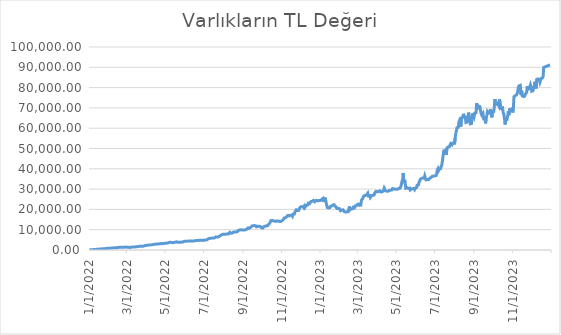
| Category | Varlıkların TL Değeri |
|---|---|
| 1/1/22 | 27.87 |
| 1/2/22 | 55.74 |
| 1/3/22 | 83.61 |
| 1/4/22 | 112.32 |
| 1/5/22 | 137.55 |
| 1/6/22 | 167.16 |
| 1/7/22 | 196 |
| 1/8/22 | 216.96 |
| 1/9/22 | 244.08 |
| 1/10/22 | 271.2 |
| 1/11/22 | 302.39 |
| 1/12/22 | 330.48 |
| 1/13/22 | 348.4 |
| 1/14/22 | 377.86 |
| 1/15/22 | 414 |
| 1/16/22 | 441.6 |
| 1/17/22 | 469.2 |
| 1/18/22 | 493.74 |
| 1/19/22 | 497.42 |
| 1/20/22 | 539 |
| 1/21/22 | 560.49 |
| 1/22/22 | 586.96 |
| 1/23/22 | 613.64 |
| 1/24/22 | 640.32 |
| 1/25/22 | 643.75 |
| 1/26/22 | 664.3 |
| 1/27/22 | 708.21 |
| 1/28/22 | 763 |
| 1/29/22 | 783.29 |
| 1/30/22 | 810.3 |
| 1/31/22 | 837.31 |
| 2/1/22 | 860.16 |
| 2/2/22 | 892.32 |
| 2/3/22 | 911.2 |
| 2/4/22 | 928.55 |
| 2/5/22 | 935.28 |
| 2/6/22 | 961.26 |
| 2/7/22 | 987.24 |
| 2/8/22 | 1026.09 |
| 2/9/22 | 1064.8 |
| 2/10/22 | 1111.1 |
| 2/11/22 | 1110.9 |
| 2/12/22 | 1133.48 |
| 2/13/22 | 1159.84 |
| 2/14/22 | 1186.2 |
| 2/15/22 | 1228.66 |
| 2/16/22 | 1282.16 |
| 2/17/22 | 1304.16 |
| 2/18/22 | 1307.32 |
| 2/19/22 | 1359.5 |
| 2/20/22 | 1386.69 |
| 2/21/22 | 1413.88 |
| 2/22/22 | 1414.04 |
| 2/23/22 | 1428.3 |
| 2/24/22 | 1364 |
| 2/25/22 | 1363.6 |
| 2/26/22 | 1403.91 |
| 2/27/22 | 1428.54 |
| 2/28/22 | 1453.17 |
| 3/1/22 | 1337.4 |
| 3/2/22 | 1324.92 |
| 3/3/22 | 1303.86 |
| 3/4/22 | 1306.62 |
| 3/5/22 | 1255.68 |
| 3/6/22 | 1275.3 |
| 3/7/22 | 1294.92 |
| 3/8/22 | 1361.44 |
| 3/9/22 | 1389.24 |
| 3/10/22 | 1442.79 |
| 3/11/22 | 1423.1 |
| 3/12/22 | 1467.57 |
| 3/13/22 | 1488.24 |
| 3/14/22 | 1508.91 |
| 3/15/22 | 1530.32 |
| 3/16/22 | 1591.5 |
| 3/17/22 | 1636.28 |
| 3/18/22 | 1669.36 |
| 3/19/22 | 1740.18 |
| 3/20/22 | 1762.49 |
| 3/21/22 | 1784.8 |
| 3/22/22 | 1823.31 |
| 3/23/22 | 1869.6 |
| 3/24/22 | 1871.65 |
| 3/25/22 | 1859.76 |
| 3/26/22 | 1872.55 |
| 3/27/22 | 1894.58 |
| 3/28/22 | 1916.61 |
| 3/29/22 | 2044.24 |
| 3/30/22 | 2248.14 |
| 3/31/22 | 2263.5 |
| 4/1/22 | 2253.16 |
| 4/2/22 | 2342.32 |
| 4/3/22 | 2367.78 |
| 4/4/22 | 2393.24 |
| 4/5/22 | 2474.75 |
| 4/6/22 | 2479.68 |
| 4/7/22 | 2490.96 |
| 4/8/22 | 2520.56 |
| 4/9/22 | 2573.01 |
| 4/10/22 | 2599 |
| 4/11/22 | 2624.99 |
| 4/12/22 | 2762.16 |
| 4/13/22 | 2797.48 |
| 4/14/22 | 2791.36 |
| 4/15/22 | 2822.4 |
| 4/16/22 | 2884.26 |
| 4/17/22 | 2911.47 |
| 4/18/22 | 2938.68 |
| 4/19/22 | 2963.71 |
| 4/20/22 | 2961.2 |
| 4/21/22 | 2991.45 |
| 4/22/22 | 3199.84 |
| 4/23/22 | 3118.8 |
| 4/24/22 | 3146.4 |
| 4/25/22 | 3174 |
| 4/26/22 | 3196.96 |
| 4/27/22 | 3125.07 |
| 4/28/22 | 3154.14 |
| 4/29/22 | 3251.08 |
| 4/30/22 | 3286.8 |
| 5/1/22 | 3314.19 |
| 5/2/22 | 3341.58 |
| 5/3/22 | 3368.97 |
| 5/4/22 | 3396.36 |
| 5/5/22 | 3423.75 |
| 5/6/22 | 3530.52 |
| 5/7/22 | 3741.42 |
| 5/8/22 | 3770.88 |
| 5/9/22 | 3800.34 |
| 5/10/22 | 3738.8 |
| 5/11/22 | 3711.23 |
| 5/12/22 | 3672.24 |
| 5/13/22 | 3596.32 |
| 5/14/22 | 3710.46 |
| 5/15/22 | 3738.15 |
| 5/16/22 | 3765.84 |
| 5/17/22 | 3879.84 |
| 5/18/22 | 3859.86 |
| 5/19/22 | 4026.83 |
| 5/20/22 | 4055.8 |
| 5/21/22 | 3812.64 |
| 5/22/22 | 3839.68 |
| 5/23/22 | 3866.72 |
| 5/24/22 | 3790.08 |
| 5/25/22 | 3825.1 |
| 5/26/22 | 3858.78 |
| 5/27/22 | 3905.79 |
| 5/28/22 | 3938.28 |
| 5/29/22 | 3964.89 |
| 5/30/22 | 3991.5 |
| 5/31/22 | 4309.54 |
| 6/1/22 | 4283.36 |
| 6/2/22 | 4261.05 |
| 6/3/22 | 4267.34 |
| 6/4/22 | 4326.05 |
| 6/5/22 | 4353.96 |
| 6/6/22 | 4381.87 |
| 6/7/22 | 4461.92 |
| 6/8/22 | 4467.9 |
| 6/9/22 | 4257.6 |
| 6/10/22 | 4404.96 |
| 6/11/22 | 4343.22 |
| 6/12/22 | 4370.03 |
| 6/13/22 | 4396.84 |
| 6/14/22 | 4374.15 |
| 6/15/22 | 4437.18 |
| 6/16/22 | 4515.68 |
| 6/17/22 | 4450.32 |
| 6/18/22 | 4620.46 |
| 6/19/22 | 4647.8 |
| 6/20/22 | 4675.14 |
| 6/21/22 | 4647.44 |
| 6/22/22 | 4671 |
| 6/23/22 | 4807.62 |
| 6/24/22 | 4845.75 |
| 6/25/22 | 4736.16 |
| 6/26/22 | 4763.07 |
| 6/27/22 | 4789.98 |
| 6/28/22 | 4816.89 |
| 6/29/22 | 4843.8 |
| 6/30/22 | 4709.62 |
| 7/1/22 | 4843.02 |
| 7/2/22 | 4862.31 |
| 7/3/22 | 4888.88 |
| 7/4/22 | 4915.45 |
| 7/5/22 | 4968.06 |
| 7/6/22 | 5049 |
| 7/7/22 | 5358 |
| 7/8/22 | 5518.8 |
| 7/9/22 | 5724.7 |
| 7/10/22 | 5754.83 |
| 7/11/22 | 5784.96 |
| 7/12/22 | 5815.09 |
| 7/13/22 | 5845.22 |
| 7/14/22 | 5855.85 |
| 7/15/22 | 5889.8 |
| 7/16/22 | 5919.85 |
| 7/17/22 | 5949.9 |
| 7/18/22 | 5979.95 |
| 7/19/22 | 6284 |
| 7/20/22 | 6474.21 |
| 7/21/22 | 6439.76 |
| 7/22/22 | 6435.1 |
| 7/23/22 | 6401.52 |
| 7/24/22 | 6432.9 |
| 7/25/22 | 6464.28 |
| 7/26/22 | 6899.31 |
| 7/27/22 | 7107.36 |
| 7/28/22 | 7208.41 |
| 7/29/22 | 7291.2 |
| 7/30/22 | 7686.73 |
| 7/31/22 | 7723.16 |
| 8/1/22 | 7759.59 |
| 8/2/22 | 7808.86 |
| 8/3/22 | 7714.2 |
| 8/4/22 | 7577.28 |
| 8/5/22 | 7812 |
| 8/6/22 | 7915.58 |
| 8/7/22 | 7951.89 |
| 8/8/22 | 7988.2 |
| 8/9/22 | 7907.38 |
| 8/10/22 | 8131.86 |
| 8/11/22 | 8692.54 |
| 8/12/22 | 8214.08 |
| 8/13/22 | 8284.5 |
| 8/14/22 | 8321.32 |
| 8/15/22 | 8358.14 |
| 8/16/22 | 8296.92 |
| 8/17/22 | 8860.01 |
| 8/18/22 | 9080.4 |
| 8/19/22 | 8928.15 |
| 8/20/22 | 8848.48 |
| 8/21/22 | 8886.62 |
| 8/22/22 | 8924.76 |
| 8/23/22 | 9063.95 |
| 8/24/22 | 9558 |
| 8/25/22 | 9420.75 |
| 8/26/22 | 9800.84 |
| 8/27/22 | 9942.4 |
| 8/28/22 | 9984 |
| 8/29/22 | 10025.6 |
| 8/30/22 | 9861.5 |
| 8/31/22 | 9902.25 |
| 9/1/22 | 9886.88 |
| 9/2/22 | 9709.35 |
| 9/3/22 | 9879.36 |
| 9/4/22 | 9919.52 |
| 9/5/22 | 9959.68 |
| 9/6/22 | 10171.65 |
| 9/7/22 | 10257.5 |
| 9/8/22 | 10441.6 |
| 9/9/22 | 10883.88 |
| 9/10/22 | 10712.02 |
| 9/11/22 | 10754.36 |
| 9/12/22 | 10796.7 |
| 9/13/22 | 11207.68 |
| 9/14/22 | 11279.73 |
| 9/15/22 | 11821.56 |
| 9/16/22 | 11820.76 |
| 9/17/22 | 11960 |
| 9/18/22 | 12006 |
| 9/19/22 | 12052 |
| 9/20/22 | 11724.54 |
| 9/21/22 | 11924.88 |
| 9/22/22 | 11402.95 |
| 9/23/22 | 11440.66 |
| 9/24/22 | 11619.84 |
| 9/25/22 | 11663.36 |
| 9/26/22 | 11706.88 |
| 9/27/22 | 11707.2 |
| 9/28/22 | 11593.38 |
| 9/29/22 | 11486.56 |
| 9/30/22 | 10936.38 |
| 10/1/22 | 10779.16 |
| 10/2/22 | 10818.5 |
| 10/3/22 | 10857.84 |
| 10/4/22 | 11564.75 |
| 10/5/22 | 11623.18 |
| 10/6/22 | 11715.21 |
| 10/7/22 | 11592 |
| 10/8/22 | 11936.88 |
| 10/9/22 | 11979.36 |
| 10/10/22 | 12021.84 |
| 10/11/22 | 12572.68 |
| 10/12/22 | 12676.8 |
| 10/13/22 | 13138.84 |
| 10/14/22 | 13032.67 |
| 10/15/22 | 14495.04 |
| 10/16/22 | 14545.37 |
| 10/17/22 | 14595.7 |
| 10/18/22 | 15059.25 |
| 10/19/22 | 14284.64 |
| 10/20/22 | 13926.29 |
| 10/21/22 | 14314.86 |
| 10/22/22 | 14050.85 |
| 10/23/22 | 14098.48 |
| 10/24/22 | 14146.11 |
| 10/25/22 | 14339.76 |
| 10/26/22 | 13957.32 |
| 10/27/22 | 14289 |
| 10/28/22 | 14330.61 |
| 10/29/22 | 13997.7 |
| 10/30/22 | 14044.05 |
| 10/31/22 | 14090.4 |
| 11/1/22 | 14435.65 |
| 11/2/22 | 14593.14 |
| 11/3/22 | 14831.17 |
| 11/4/22 | 15169 |
| 11/5/22 | 15777.54 |
| 11/6/22 | 15828.6 |
| 11/7/22 | 15879.66 |
| 11/8/22 | 15593.76 |
| 11/9/22 | 16535.79 |
| 11/10/22 | 16403.36 |
| 11/11/22 | 17044.65 |
| 11/12/22 | 16757.48 |
| 11/13/22 | 16810.51 |
| 11/14/22 | 16863.54 |
| 11/15/22 | 17165.39 |
| 11/16/22 | 17564.8 |
| 11/17/22 | 17212.02 |
| 11/18/22 | 16679.6 |
| 11/19/22 | 17603.5 |
| 11/20/22 | 17658 |
| 11/21/22 | 17712.5 |
| 11/22/22 | 18806.94 |
| 11/23/22 | 19201.44 |
| 11/24/22 | 19807.92 |
| 11/25/22 | 19529.44 |
| 11/26/22 | 19427.1 |
| 11/27/22 | 19485.97 |
| 11/28/22 | 19544.84 |
| 11/29/22 | 20569.41 |
| 11/30/22 | 20564.38 |
| 12/1/22 | 21252.4 |
| 12/2/22 | 21084 |
| 12/3/22 | 21261.33 |
| 12/4/22 | 21324.42 |
| 12/5/22 | 21387.51 |
| 12/6/22 | 20865.8 |
| 12/7/22 | 21663.73 |
| 12/8/22 | 21108.24 |
| 12/9/22 | 21338.03 |
| 12/10/22 | 22057.28 |
| 12/11/22 | 22121.4 |
| 12/12/22 | 22185.52 |
| 12/13/22 | 23016.51 |
| 12/14/22 | 23152.44 |
| 12/15/22 | 22789.7 |
| 12/16/22 | 23026.5 |
| 12/17/22 | 23850.45 |
| 12/18/22 | 23918.4 |
| 12/19/22 | 23986.35 |
| 12/20/22 | 23916.24 |
| 12/21/22 | 24402.7 |
| 12/22/22 | 23912.52 |
| 12/23/22 | 23786.91 |
| 12/24/22 | 24293.88 |
| 12/25/22 | 24361.74 |
| 12/26/22 | 24429.6 |
| 12/27/22 | 24511.9 |
| 12/28/22 | 24170.74 |
| 12/29/22 | 24077.79 |
| 12/30/22 | 24413.48 |
| 12/31/22 | 24356.45 |
| 1/1/23 | 24423.18 |
| 1/2/23 | 24489.91 |
| 1/3/23 | 24862.08 |
| 1/4/23 | 25110.45 |
| 1/5/23 | 25359.8 |
| 1/6/23 | 23680.93 |
| 1/7/23 | 25169.52 |
| 1/8/23 | 25237.18 |
| 1/9/23 | 25304.84 |
| 1/10/23 | 23587.5 |
| 1/11/23 | 22319.36 |
| 1/12/23 | 20934.81 |
| 1/13/23 | 21084.84 |
| 1/14/23 | 20731.3 |
| 1/15/23 | 20786 |
| 1/16/23 | 20840.7 |
| 1/17/23 | 21418.74 |
| 1/18/23 | 21739.08 |
| 1/19/23 | 21738.24 |
| 1/20/23 | 21929.6 |
| 1/21/23 | 22175.7 |
| 1/22/23 | 22233.15 |
| 1/23/23 | 22290.6 |
| 1/24/23 | 21659.52 |
| 1/25/23 | 21715.2 |
| 1/26/23 | 21211.75 |
| 1/27/23 | 20478.08 |
| 1/28/23 | 20357.4 |
| 1/29/23 | 20409.2 |
| 1/30/23 | 20461 |
| 1/31/23 | 20397.96 |
| 2/1/23 | 20350.22 |
| 2/2/23 | 19354.74 |
| 2/3/23 | 19307.61 |
| 2/4/23 | 19680 |
| 2/5/23 | 19729.2 |
| 2/6/23 | 19778.4 |
| 2/7/23 | 19666.4 |
| 2/8/23 | 18858.72 |
| 2/9/23 | 18658.35 |
| 2/10/23 | 18704.42 |
| 2/11/23 | 18750.49 |
| 2/12/23 | 18796.56 |
| 2/13/23 | 18842.63 |
| 2/14/23 | 18888.7 |
| 2/15/23 | 18934.77 |
| 2/16/23 | 21424 |
| 2/17/23 | 19832.26 |
| 2/18/23 | 20294.28 |
| 2/19/23 | 20343.3 |
| 2/20/23 | 20392.32 |
| 2/21/23 | 20349.6 |
| 2/22/23 | 21037.94 |
| 2/23/23 | 20820.11 |
| 2/24/23 | 20827.8 |
| 2/25/23 | 21685.71 |
| 2/26/23 | 21737.22 |
| 2/27/23 | 21788.73 |
| 2/28/23 | 22234.56 |
| 3/1/23 | 22559 |
| 3/2/23 | 22590.78 |
| 3/3/23 | 22643.81 |
| 3/4/23 | 22003.48 |
| 3/5/23 | 22054.89 |
| 3/6/23 | 22106.3 |
| 3/7/23 | 24549.76 |
| 3/8/23 | 24200.64 |
| 3/9/23 | 25382.46 |
| 3/10/23 | 26209.26 |
| 3/11/23 | 26717.7 |
| 3/12/23 | 26779.12 |
| 3/13/23 | 26840.54 |
| 3/14/23 | 26858.16 |
| 3/15/23 | 27156.54 |
| 3/16/23 | 27002.8 |
| 3/17/23 | 28016.73 |
| 3/18/23 | 26626.08 |
| 3/19/23 | 26686.32 |
| 3/20/23 | 26746.56 |
| 3/21/23 | 25867.85 |
| 3/22/23 | 25970.58 |
| 3/23/23 | 26775.3 |
| 3/24/23 | 26835.2 |
| 3/25/23 | 26962.45 |
| 3/26/23 | 27022.5 |
| 3/27/23 | 27082.55 |
| 3/28/23 | 28096.32 |
| 3/29/23 | 27714.54 |
| 3/30/23 | 28888.02 |
| 3/31/23 | 28906.15 |
| 4/1/23 | 28682.4 |
| 4/2/23 | 28745.3 |
| 4/3/23 | 28808.2 |
| 4/4/23 | 28802.25 |
| 4/5/23 | 29136.4 |
| 4/6/23 | 28904.7 |
| 4/7/23 | 28560.84 |
| 4/8/23 | 28641.18 |
| 4/9/23 | 28703.04 |
| 4/10/23 | 28764.9 |
| 4/11/23 | 29376.64 |
| 4/12/23 | 30448.4 |
| 4/13/23 | 29825.64 |
| 4/14/23 | 29129.59 |
| 4/15/23 | 28937.9 |
| 4/16/23 | 28999.47 |
| 4/17/23 | 29061.04 |
| 4/18/23 | 28961.79 |
| 4/19/23 | 29440.14 |
| 4/20/23 | 29364.5 |
| 4/21/23 | 29378.72 |
| 4/22/23 | 29440.44 |
| 4/23/23 | 29502.16 |
| 4/24/23 | 29563.88 |
| 4/25/23 | 30235.2 |
| 4/26/23 | 29754.66 |
| 4/27/23 | 30173.2 |
| 4/28/23 | 30424.17 |
| 4/29/23 | 29896.68 |
| 4/30/23 | 29958.45 |
| 5/1/23 | 30020.22 |
| 5/2/23 | 30081.99 |
| 5/3/23 | 29904.64 |
| 5/4/23 | 30132.18 |
| 5/5/23 | 30335.9 |
| 5/6/23 | 30397.81 |
| 5/7/23 | 30459.72 |
| 5/8/23 | 30521.63 |
| 5/9/23 | 32016.14 |
| 5/10/23 | 33927.3 |
| 5/11/23 | 34630.72 |
| 5/12/23 | 37945.95 |
| 5/13/23 | 33619.98 |
| 5/14/23 | 33687.49 |
| 5/15/23 | 33755 |
| 5/16/23 | 30450.78 |
| 5/17/23 | 30737.46 |
| 5/18/23 | 30672.94 |
| 5/19/23 | 30315.6 |
| 5/20/23 | 30375.75 |
| 5/21/23 | 30435.9 |
| 5/22/23 | 30496.05 |
| 5/23/23 | 29616.4 |
| 5/24/23 | 29369.3 |
| 5/25/23 | 30141 |
| 5/26/23 | 30149 |
| 5/27/23 | 30182.4 |
| 5/28/23 | 30241.35 |
| 5/29/23 | 30300.3 |
| 5/30/23 | 29792.75 |
| 5/31/23 | 30444 |
| 6/1/23 | 30322.05 |
| 6/2/23 | 30717.4 |
| 6/3/23 | 31918.5 |
| 6/4/23 | 31980 |
| 6/5/23 | 32041.5 |
| 6/6/23 | 33408 |
| 6/7/23 | 33995 |
| 6/8/23 | 34846 |
| 6/9/23 | 35096.25 |
| 6/10/23 | 35320.9 |
| 6/11/23 | 35388.05 |
| 6/12/23 | 35455.2 |
| 6/13/23 | 35469.45 |
| 6/14/23 | 35324.5 |
| 6/15/23 | 36479.7 |
| 6/16/23 | 35378 |
| 6/17/23 | 34565.05 |
| 6/18/23 | 34629.9 |
| 6/19/23 | 34694.75 |
| 6/20/23 | 34223.6 |
| 6/21/23 | 34663.35 |
| 6/22/23 | 34324.4 |
| 6/23/23 | 35358.4 |
| 6/24/23 | 35721 |
| 6/25/23 | 35787.15 |
| 6/26/23 | 35853.3 |
| 6/27/23 | 36326.7 |
| 6/28/23 | 36339.2 |
| 6/29/23 | 36406 |
| 6/30/23 | 36472.8 |
| 7/1/23 | 36539.6 |
| 7/2/23 | 36606.4 |
| 7/3/23 | 36673.2 |
| 7/4/23 | 37675 |
| 7/5/23 | 39479.15 |
| 7/6/23 | 40102.8 |
| 7/7/23 | 39263 |
| 7/8/23 | 39915.7 |
| 7/9/23 | 39987.75 |
| 7/10/23 | 40059.8 |
| 7/11/23 | 41245.85 |
| 7/12/23 | 41850 |
| 7/13/23 | 44049.2 |
| 7/14/23 | 46452 |
| 7/15/23 | 48807 |
| 7/16/23 | 48894 |
| 7/17/23 | 48981 |
| 7/18/23 | 49321.8 |
| 7/19/23 | 46866.75 |
| 7/20/23 | 50147.6 |
| 7/21/23 | 49924.35 |
| 7/22/23 | 50779.2 |
| 7/23/23 | 50868.6 |
| 7/24/23 | 50958 |
| 7/25/23 | 50476.4 |
| 7/26/23 | 52366.6 |
| 7/27/23 | 52773.3 |
| 7/28/23 | 51832.2 |
| 7/29/23 | 52612.5 |
| 7/30/23 | 52704 |
| 7/31/23 | 52795.5 |
| 8/1/23 | 52048.9 |
| 8/2/23 | 55062.9 |
| 8/3/23 | 57420 |
| 8/4/23 | 58739.1 |
| 8/5/23 | 60237 |
| 8/6/23 | 60340.5 |
| 8/7/23 | 60444 |
| 8/8/23 | 63004.5 |
| 8/9/23 | 63874 |
| 8/10/23 | 63219.9 |
| 8/11/23 | 60740.4 |
| 8/12/23 | 65084.5 |
| 8/13/23 | 65195 |
| 8/14/23 | 65305.5 |
| 8/15/23 | 67073.6 |
| 8/16/23 | 66119.5 |
| 8/17/23 | 66231 |
| 8/18/23 | 65509.5 |
| 8/19/23 | 62818.4 |
| 8/20/23 | 62923.8 |
| 8/21/23 | 63029.2 |
| 8/22/23 | 64751.9 |
| 8/23/23 | 67680 |
| 8/24/23 | 66951.4 |
| 8/25/23 | 63089.6 |
| 8/26/23 | 62109 |
| 8/27/23 | 62212 |
| 8/28/23 | 62315 |
| 8/29/23 | 65205.6 |
| 8/30/23 | 67437.7 |
| 8/31/23 | 67548.8 |
| 9/1/23 | 65711.1 |
| 9/2/23 | 67405 |
| 9/3/23 | 67515.5 |
| 9/4/23 | 67626 |
| 9/5/23 | 72334 |
| 9/6/23 | 70610 |
| 9/7/23 | 69310.5 |
| 9/8/23 | 70901.6 |
| 9/9/23 | 70535.44 |
| 9/10/23 | 70649.76 |
| 9/11/23 | 70764.08 |
| 9/12/23 | 67257.6 |
| 9/13/23 | 66509.1 |
| 9/14/23 | 66796.58 |
| 9/15/23 | 67340.07 |
| 9/16/23 | 64771.2 |
| 9/17/23 | 64875 |
| 9/18/23 | 64978.8 |
| 9/19/23 | 62386.5 |
| 9/20/23 | 64370 |
| 9/21/23 | 64095.1 |
| 9/22/23 | 67914 |
| 9/23/23 | 67327.7 |
| 9/24/23 | 67434.4 |
| 9/25/23 | 67541.1 |
| 9/26/23 | 67901.4 |
| 9/27/23 | 69342 |
| 9/28/23 | 66970.8 |
| 9/29/23 | 65292.5 |
| 9/30/23 | 67947 |
| 10/1/23 | 68053.5 |
| 10/2/23 | 68160 |
| 10/3/23 | 70702.3 |
| 10/4/23 | 74279.4 |
| 10/5/23 | 71244.4 |
| 10/6/23 | 72514.4 |
| 10/7/23 | 72175.5 |
| 10/8/23 | 72287.4 |
| 10/9/23 | 72399.3 |
| 10/10/23 | 71020.8 |
| 10/11/23 | 74245.6 |
| 10/12/23 | 72475 |
| 10/13/23 | 70959 |
| 10/14/23 | 69764 |
| 10/15/23 | 69871 |
| 10/16/23 | 69978 |
| 10/17/23 | 67596 |
| 10/18/23 | 66780.8 |
| 10/19/23 | 64747.35 |
| 10/20/23 | 61852 |
| 10/21/23 | 64054.8 |
| 10/22/23 | 64152 |
| 10/23/23 | 64249.2 |
| 10/24/23 | 66001.4 |
| 10/25/23 | 68289 |
| 10/26/23 | 66400 |
| 10/27/23 | 69160 |
| 10/28/23 | 69197.4 |
| 10/29/23 | 69301.3 |
| 10/30/23 | 69405.2 |
| 10/31/23 | 69576 |
| 11/1/23 | 67737 |
| 11/2/23 | 69784 |
| 11/3/23 | 75532.8 |
| 11/4/23 | 75914.4 |
| 11/5/23 | 76027.2 |
| 11/6/23 | 76140 |
| 11/7/23 | 76388 |
| 11/8/23 | 77110.3 |
| 11/9/23 | 78241.2 |
| 11/10/23 | 80257.8 |
| 11/11/23 | 80852 |
| 11/12/23 | 80970.9 |
| 11/13/23 | 81089.8 |
| 11/14/23 | 76496 |
| 11/15/23 | 78523.2 |
| 11/16/23 | 75966.5 |
| 11/17/23 | 75734.4 |
| 11/18/23 | 75570 |
| 11/19/23 | 75680 |
| 11/20/23 | 75790 |
| 11/21/23 | 76797 |
| 11/22/23 | 76701 |
| 11/23/23 | 77573.2 |
| 11/24/23 | 80665.2 |
| 11/25/23 | 79185.4 |
| 11/26/23 | 79299.5 |
| 11/27/23 | 79413.6 |
| 11/28/23 | 80364.1 |
| 11/29/23 | 81317 |
| 11/30/23 | 80175.3 |
| 12/1/23 | 78190 |
| 12/2/23 | 78301.7 |
| 12/3/23 | 78413.4 |
| 12/4/23 | 78525.1 |
| 12/5/23 | 80608 |
| 12/6/23 | 82908 |
| 12/7/23 | 81331.2 |
| 12/8/23 | 79537.5 |
| 12/9/23 | 84039.6 |
| 12/10/23 | 84158.3 |
| 12/11/23 | 84277 |
| 12/12/23 | 84609 |
| 12/13/23 | 83873.6 |
| 12/14/23 | 82636.7 |
| 12/15/23 | 83609.4 |
| 12/16/23 | 84513 |
| 12/17/23 | 84631.2 |
| 12/18/23 | 84749.4 |
| 12/19/23 | 85298.4 |
| 12/20/23 | 89946.9 |
| 12/21/23 | 90072 |
| 12/22/23 | 90197.1 |
| 12/23/23 | 90322.2 |
| 12/24/23 | 90447.3 |
| 12/25/23 | 90572.4 |
| 12/26/23 | 90697.5 |
| 12/27/23 | 90822.6 |
| 12/28/23 | 90947.7 |
| 12/29/23 | 91072.8 |
| 12/30/23 | 91197.9 |
| 12/31/23 | 91323 |